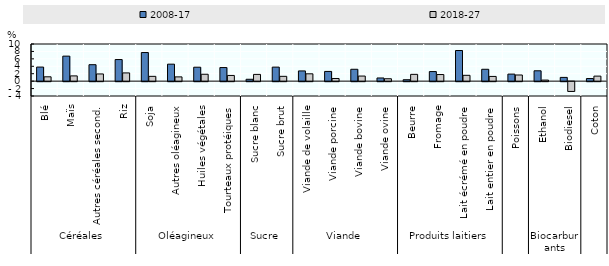
| Category | 2008-17 | 2018-27 |
|---|---|---|
| 0 | 3.788 | 1.168 |
| 1 | 6.735 | 1.411 |
| 2 | 4.428 | 1.94 |
| 3 | 5.812 | 2.217 |
| 4 | 7.7 | 1.29 |
| 5 | 4.573 | 1.147 |
| 6 | 3.751 | 1.853 |
| 7 | 3.658 | 1.536 |
| 8 | 0.502 | 1.817 |
| 9 | 3.777 | 1.295 |
| 10 | 2.748 | 1.974 |
| 11 | 2.617 | 0.715 |
| 12 | 3.194 | 1.371 |
| 13 | 0.851 | 0.648 |
| 14 | 0.382 | 1.83 |
| 15 | 2.579 | 1.779 |
| 16 | 8.249 | 1.568 |
| 17 | 3.198 | 1.271 |
| 18 | 1.894 | 1.658 |
| 19 | 2.787 | 0.286 |
| 20 | 1.007 | -2.637 |
| 21 | 0.7 | 1.353 |